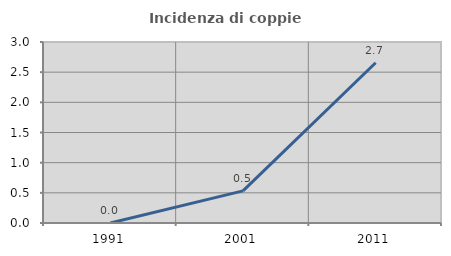
| Category | Incidenza di coppie miste |
|---|---|
| 1991.0 | 0 |
| 2001.0 | 0.532 |
| 2011.0 | 2.657 |